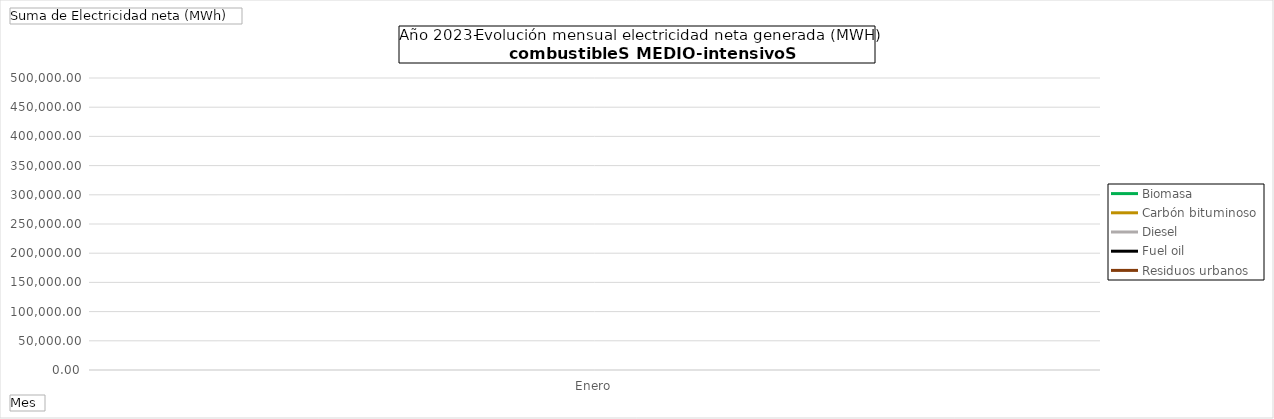
| Category | Biomasa | Carbón bituminoso | Diesel | Fuel oil | Residuos urbanos |
|---|---|---|---|---|---|
| Enero | 229179.683 | 193905.33 | 444569.713 | 280174.75 | 91944.503 |